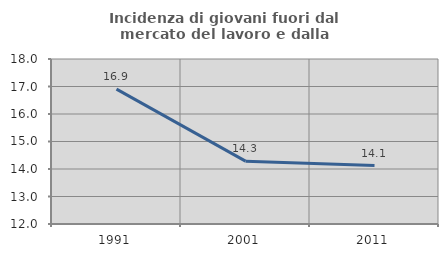
| Category | Incidenza di giovani fuori dal mercato del lavoro e dalla formazione  |
|---|---|
| 1991.0 | 16.906 |
| 2001.0 | 14.286 |
| 2011.0 | 14.124 |